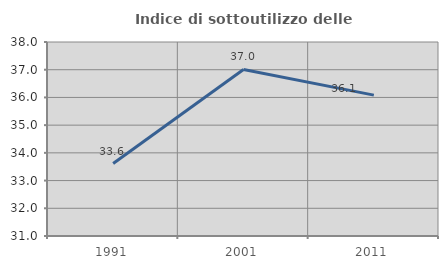
| Category | Indice di sottoutilizzo delle abitazioni  |
|---|---|
| 1991.0 | 33.613 |
| 2001.0 | 37.009 |
| 2011.0 | 36.084 |